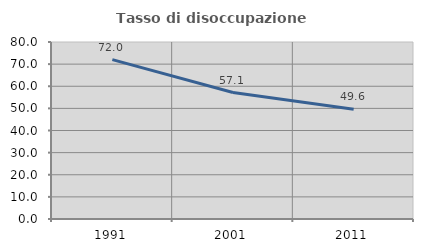
| Category | Tasso di disoccupazione giovanile  |
|---|---|
| 1991.0 | 72.026 |
| 2001.0 | 57.143 |
| 2011.0 | 49.563 |